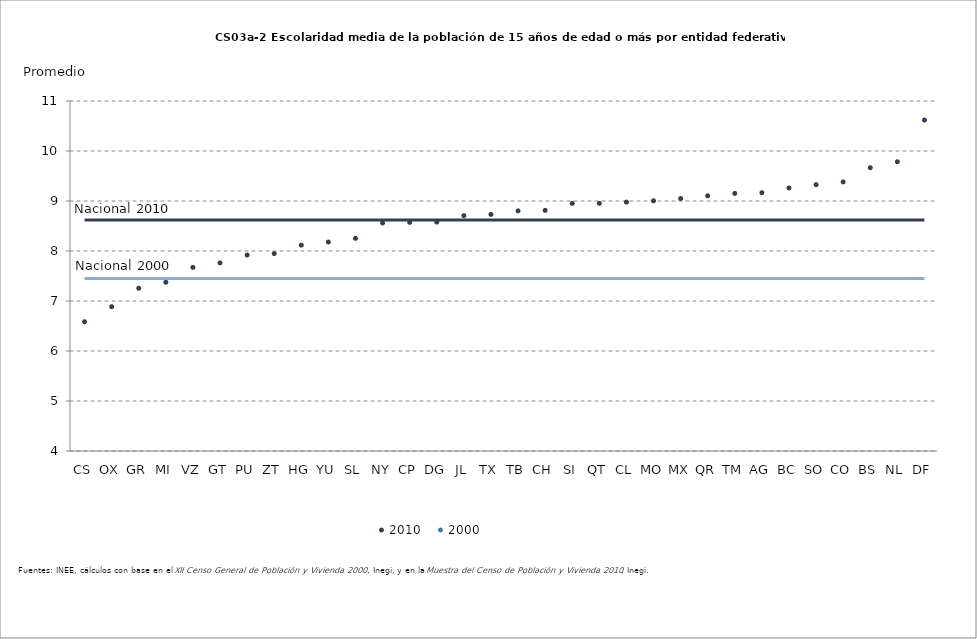
| Category | 2010 | Nal 2000 | Nal 2010 |
|---|---|---|---|
| CS | 6.585 | 7.451 | 8.619 |
| OX | 6.886 | 7.451 | 8.619 |
| GR | 7.255 | 7.451 | 8.619 |
| MI | 7.376 | 7.451 | 8.619 |
| VZ | 7.672 | 7.451 | 8.619 |
| GT | 7.762 | 7.451 | 8.619 |
| PU | 7.919 | 7.451 | 8.619 |
| ZT | 7.948 | 7.451 | 8.619 |
| HG | 8.117 | 7.451 | 8.619 |
| YU | 8.18 | 7.451 | 8.619 |
| SL | 8.253 | 7.451 | 8.619 |
| NY | 8.56 | 7.451 | 8.619 |
| CP | 8.574 | 7.451 | 8.619 |
| DG | 8.578 | 7.451 | 8.619 |
| JL | 8.707 | 7.451 | 8.619 |
| TX | 8.732 | 7.451 | 8.619 |
| TB | 8.803 | 7.451 | 8.619 |
| CH | 8.813 | 7.451 | 8.619 |
| SI | 8.951 | 7.451 | 8.619 |
| QT | 8.953 | 7.451 | 8.619 |
| CL | 8.978 | 7.451 | 8.619 |
| MO | 9.004 | 7.451 | 8.619 |
| MX | 9.05 | 7.451 | 8.619 |
| QR | 9.104 | 7.451 | 8.619 |
| TM | 9.151 | 7.451 | 8.619 |
| AG | 9.166 | 7.451 | 8.619 |
| BC | 9.261 | 7.451 | 8.619 |
| SO | 9.326 | 7.451 | 8.619 |
| CO | 9.382 | 7.451 | 8.619 |
| BS | 9.666 | 7.451 | 8.619 |
| NL | 9.785 | 7.451 | 8.619 |
| DF | 10.619 | 7.451 | 8.619 |